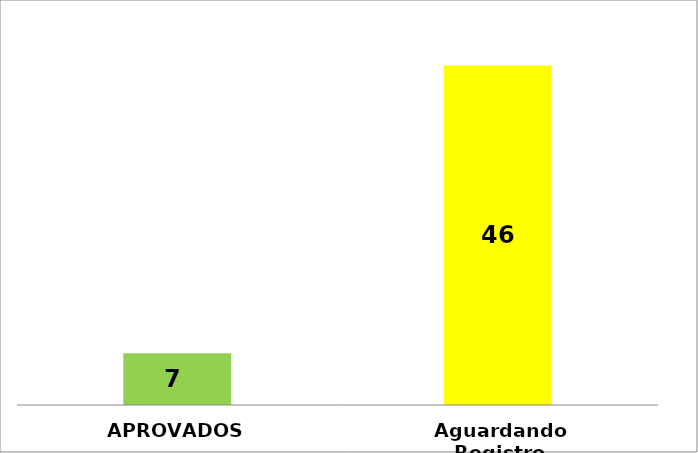
| Category | Series 0 |
|---|---|
| APROVADOS | 7 |
| Aguardando Registro | 46 |